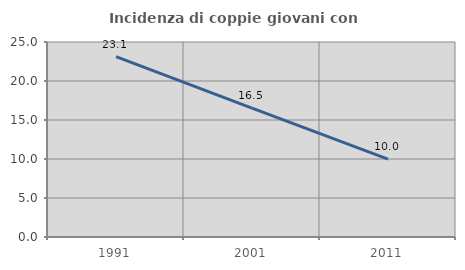
| Category | Incidenza di coppie giovani con figli |
|---|---|
| 1991.0 | 23.135 |
| 2001.0 | 16.515 |
| 2011.0 | 9.984 |